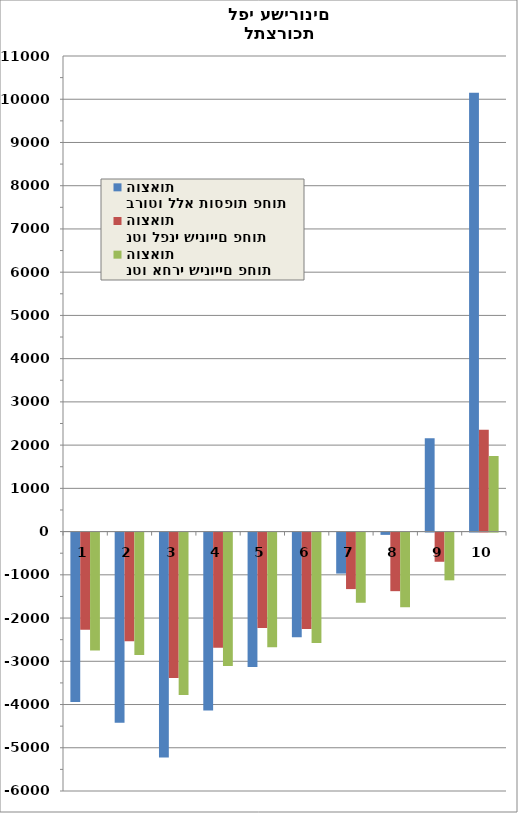
| Category | ברוטו ללא תוספות פחות הוצאות | נטו לפני שינויים פחות הוצאות | נטו אחרי שינויים פחות הוצאות |
|---|---|---|---|
| 0 | -3917 | -2246 | -2726.05 |
| 1 | -4397 | -2516 | -2832.63 |
| 2 | -5203 | -3365 | -3759.02 |
| 3 | -4116 | -2666 | -3084.21 |
| 4 | -3108 | -2209 | -2654.115 |
| 5 | -2419 | -2231 | -2555.03 |
| 6 | -948 | -1307 | -1623.255 |
| 7 | -53 | -1355 | -1726.63 |
| 8 | 2156 | -675 | -1104.455 |
| 9 | 10150 | 2353 | 1748.5 |